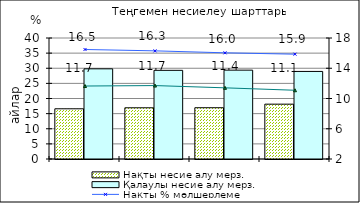
| Category | Нақты несие алу мерз. | Қалаулы несие алу мерз. |
|---|---|---|
| 0 | 16.6 | 29.81 |
| 1 | 16.93 | 29.31 |
| 2 | 16.95 | 29.37 |
| 3 | 18.13 | 28.95 |